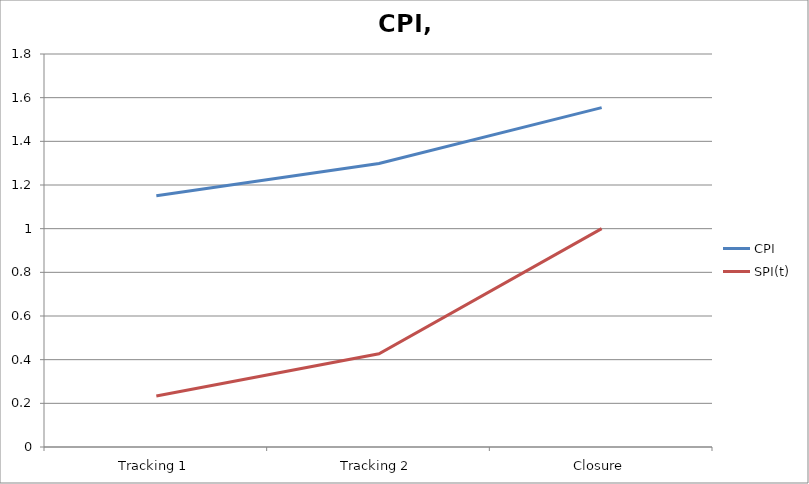
| Category | CPI | SPI(t) |
|---|---|---|
| Tracking 1 | 1.15 | 0.234 |
| Tracking 2 | 1.299 | 0.427 |
| Closure | 1.554 | 1 |